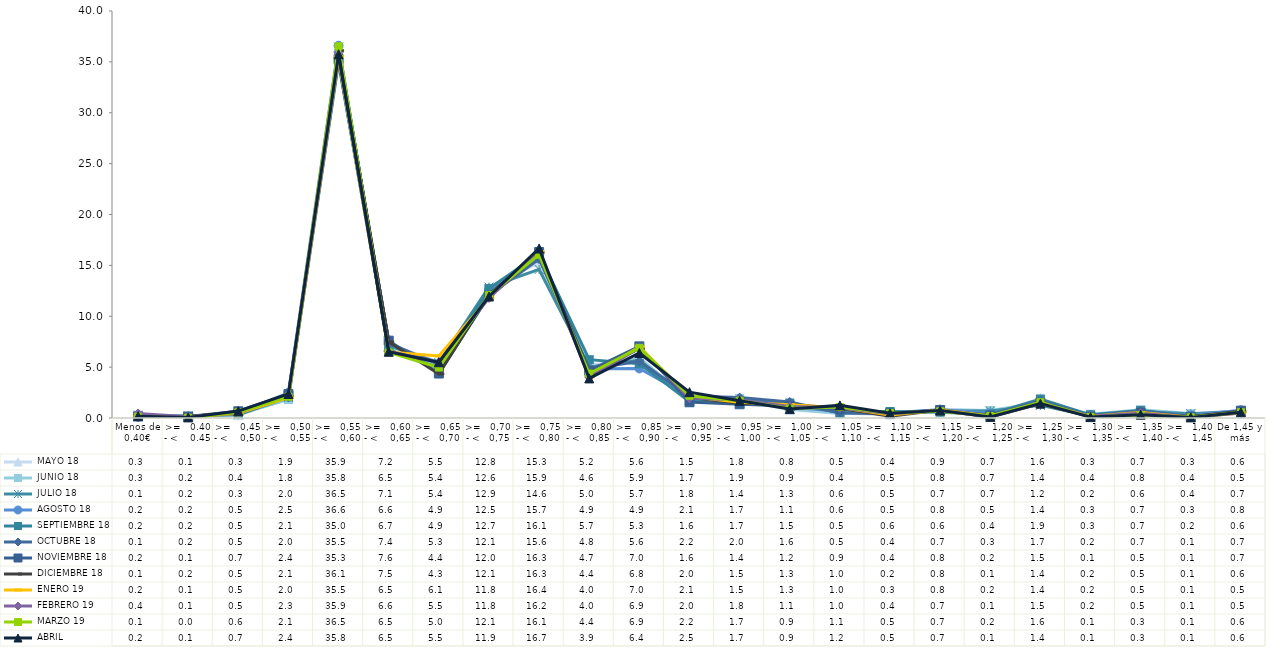
| Category |  MAYO 18 |  JUNIO 18 |  JULIO 18 |  AGOSTO 18 |  SEPTIEMBRE 18 |  OCTUBRE 18 |  NOVIEMBRE 18 |  DICIEMBRE 18 |  ENERO 19 |  FEBRERO 19 |  MARZO 19 |  ABRIL  |
|---|---|---|---|---|---|---|---|---|---|---|---|---|
| Menos de 0,40€ | 0.25 | 0.28 | 0.12 | 0.15 | 0.17 | 0.08 | 0.16 | 0.07 | 0.2 | 0.44 | 0.13 | 0.18 |
| >=   0.40 - <    0.45 | 0.11 | 0.17 | 0.22 | 0.15 | 0.15 | 0.15 | 0.14 | 0.18 | 0.08 | 0.12 | 0.03 | 0.06 |
| >=   0,45 - <    0,50 | 0.28 | 0.4 | 0.33 | 0.47 | 0.45 | 0.53 | 0.66 | 0.47 | 0.46 | 0.52 | 0.56 | 0.68 |
| >=   0,50 - <    0,55 | 1.94 | 1.81 | 2.02 | 2.48 | 2.09 | 2.02 | 2.35 | 2.08 | 2 | 2.28 | 2.09 | 2.36 |
| >=   0,55 - <    0,60 | 35.9 | 35.81 | 36.45 | 36.59 | 34.99 | 35.48 | 35.27 | 36.11 | 35.5 | 35.91 | 36.53 | 35.75 |
| >=   0,60 - <    0,65 | 7.24 | 6.54 | 7.09 | 6.6 | 6.71 | 7.36 | 7.6 | 7.48 | 6.48 | 6.55 | 6.45 | 6.51 |
| >=   0,65 - <   0,70 | 5.48 | 5.37 | 5.43 | 4.89 | 4.94 | 5.26 | 4.37 | 4.33 | 6.09 | 5.48 | 4.96 | 5.48 |
| >=   0,70 - <   0,75 | 12.8 | 12.63 | 12.87 | 12.53 | 12.72 | 12.06 | 12.03 | 12.14 | 11.8 | 11.8 | 12.07 | 11.94 |
| >=   0,75 - <   0,80 | 15.29 | 15.89 | 14.6 | 15.68 | 16.11 | 15.63 | 16.31 | 16.26 | 16.37 | 16.24 | 16.05 | 16.66 |
| >=   0,80 - <   0,85 | 5.24 | 4.61 | 5.02 | 4.85 | 5.73 | 4.81 | 4.65 | 4.4 | 4.02 | 4.03 | 4.37 | 3.89 |
| >=   0,85 - <   0,90 | 5.56 | 5.93 | 5.66 | 4.87 | 5.34 | 5.57 | 7.04 | 6.84 | 6.98 | 6.85 | 6.9 | 6.39 |
| >=   0,90 - <    0,95 | 1.52 | 1.71 | 1.79 | 2.1 | 1.62 | 2.15 | 1.56 | 2.04 | 2.1 | 1.96 | 2.19 | 2.54 |
| >=   0,95 - <   1,00 | 1.79 | 1.92 | 1.43 | 1.74 | 1.68 | 2.01 | 1.35 | 1.45 | 1.54 | 1.76 | 1.7 | 1.69 |
| >=   1,00 - <   1,05 | 0.81 | 0.91 | 1.3 | 1.1 | 1.47 | 1.58 | 1.18 | 1.33 | 1.31 | 1.14 | 0.93 | 0.88 |
| >=   1,05 - <    1,10 | 0.46 | 0.44 | 0.63 | 0.64 | 0.52 | 0.5 | 0.9 | 0.95 | 1.02 | 1.01 | 1.08 | 1.24 |
| >=   1,10 - <   1,15 | 0.35 | 0.54 | 0.45 | 0.48 | 0.64 | 0.42 | 0.44 | 0.18 | 0.29 | 0.42 | 0.48 | 0.46 |
| >=   1,15 - <    1,20 | 0.86 | 0.78 | 0.7 | 0.82 | 0.57 | 0.71 | 0.79 | 0.78 | 0.79 | 0.71 | 0.66 | 0.73 |
| >=   1,20 - <    1,25 | 0.71 | 0.73 | 0.69 | 0.46 | 0.38 | 0.3 | 0.23 | 0.09 | 0.2 | 0.12 | 0.19 | 0.11 |
| >=   1,25 - <    1,30 | 1.56 | 1.42 | 1.24 | 1.43 | 1.87 | 1.68 | 1.5 | 1.43 | 1.43 | 1.46 | 1.55 | 1.41 |
| >=   1,30 - <    1,35 | 0.28 | 0.37 | 0.2 | 0.28 | 0.31 | 0.21 | 0.1 | 0.15 | 0.18 | 0.18 | 0.11 | 0.09 |
| >=   1,35 - <    1,40 | 0.67 | 0.81 | 0.63 | 0.68 | 0.73 | 0.68 | 0.5 | 0.45 | 0.53 | 0.46 | 0.3 | 0.33 |
| >=   1,40 - <    1,45 | 0.31 | 0.42 | 0.43 | 0.25 | 0.18 | 0.14 | 0.11 | 0.12 | 0.08 | 0.06 | 0.07 | 0.06 |
| De 1,45 y más | 0.59 | 0.51 | 0.68 | 0.76 | 0.61 | 0.67 | 0.72 | 0.63 | 0.5 | 0.49 | 0.57 | 0.56 |